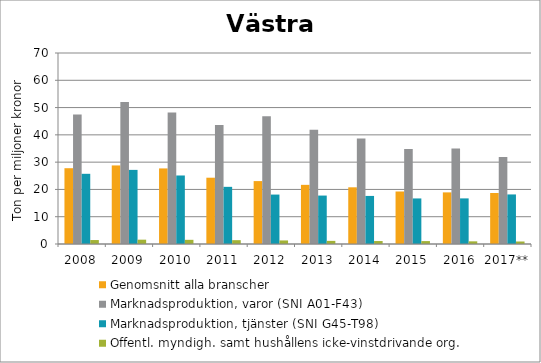
| Category | Genomsnitt alla branscher | Marknadsproduktion, varor (SNI A01-F43) | Marknadsproduktion, tjänster (SNI G45-T98) | Offentl. myndigh. samt hushållens icke-vinstdrivande org. |
|---|---|---|---|---|
| 2008 | 27.776 | 47.434 | 25.726 | 1.451 |
| 2009 | 28.793 | 52.041 | 27.161 | 1.584 |
| 2010 | 27.701 | 48.193 | 25.11 | 1.532 |
| 2011 | 24.296 | 43.613 | 20.948 | 1.403 |
| 2012 | 23.056 | 46.783 | 18.116 | 1.306 |
| 2013 | 21.677 | 41.91 | 17.752 | 1.146 |
| 2014 | 20.778 | 38.709 | 17.62 | 1.087 |
| 2015 | 19.244 | 34.782 | 16.697 | 1.067 |
| 2016 | 18.918 | 34.966 | 16.716 | 0.976 |
| 2017** | 18.699 | 31.892 | 18.162 | 0.916 |